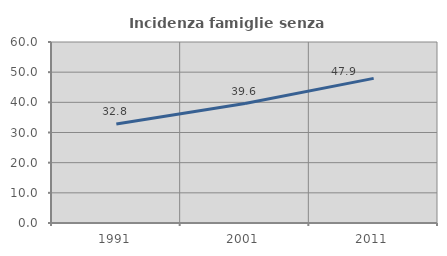
| Category | Incidenza famiglie senza nuclei |
|---|---|
| 1991.0 | 32.836 |
| 2001.0 | 39.583 |
| 2011.0 | 47.945 |